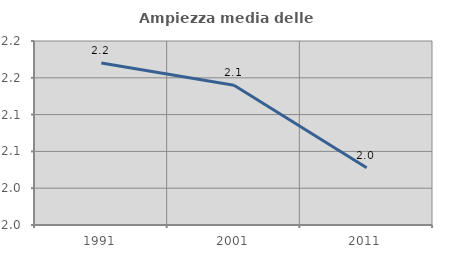
| Category | Ampiezza media delle famiglie |
|---|---|
| 1991.0 | 2.17 |
| 2001.0 | 2.14 |
| 2011.0 | 2.028 |